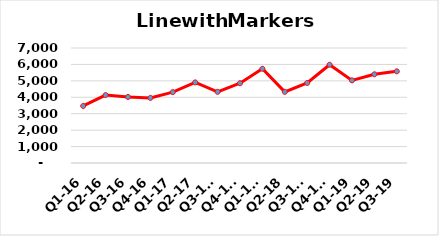
| Category | Series 0 |
|---|---|
| Q1-16 | 3472 |
| Q2-16 | 4134 |
| Q3-16 | 4021 |
| Q4-16 | 3964 |
| Q1-17 | 4315 |
| Q2-17 | 4907 |
| Q3-17 | 4331.4 |
| Q4-17 | 4856 |
| Q1-18 | 5738 |
| Q2-18 | 4330 |
| Q3-18 | 4873 |
| Q4-18 | 5981 |
| Q1-19 | 5030 |
| Q2-19 | 5400 |
| Q3-19 | 5580 |